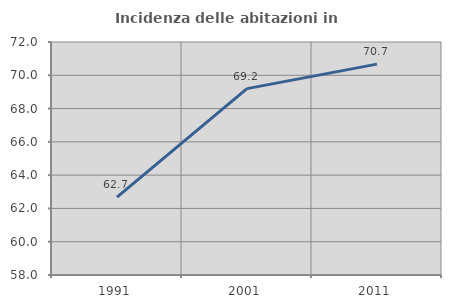
| Category | Incidenza delle abitazioni in proprietà  |
|---|---|
| 1991.0 | 62.684 |
| 2001.0 | 69.199 |
| 2011.0 | 70.67 |